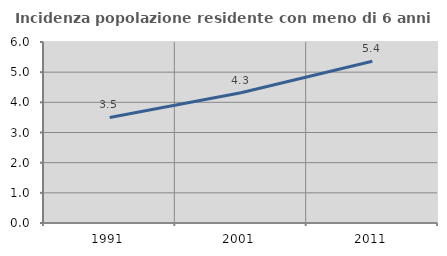
| Category | Incidenza popolazione residente con meno di 6 anni |
|---|---|
| 1991.0 | 3.499 |
| 2001.0 | 4.32 |
| 2011.0 | 5.362 |